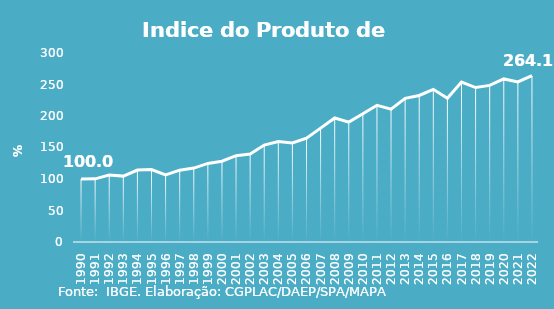
| Category | Indice de Prod. base 1990 |
|---|---|
| 1990.0 | 100 |
| 1991.0 | 100.275 |
| 1992.0 | 106.203 |
| 1993.0 | 104.57 |
| 1994.0 | 114.164 |
| 1995.0 | 115.024 |
| 1996.0 | 106.552 |
| 1997.0 | 114.037 |
| 1998.0 | 117.319 |
| 1999.0 | 124.734 |
| 2000.0 | 128.293 |
| 2001.0 | 136.975 |
| 2002.0 | 139.51 |
| 2003.0 | 153.868 |
| 2004.0 | 159.641 |
| 2005.0 | 157.136 |
| 2006.0 | 164.858 |
| 2007.0 | 180.781 |
| 2008.0 | 196.91 |
| 2009.0 | 190.309 |
| 2010.0 | 203.581 |
| 2011.0 | 217.041 |
| 2012.0 | 210.932 |
| 2013.0 | 228.009 |
| 2014.0 | 232.562 |
| 2015.0 | 242.318 |
| 2016.0 | 228.239 |
| 2017.0 | 253.826 |
| 2018.0 | 245.134 |
| 2019.0 | 248.619 |
| 2020.0 | 258.848 |
| 2021.0 | 254.181 |
| 2022.0 | 264.082 |